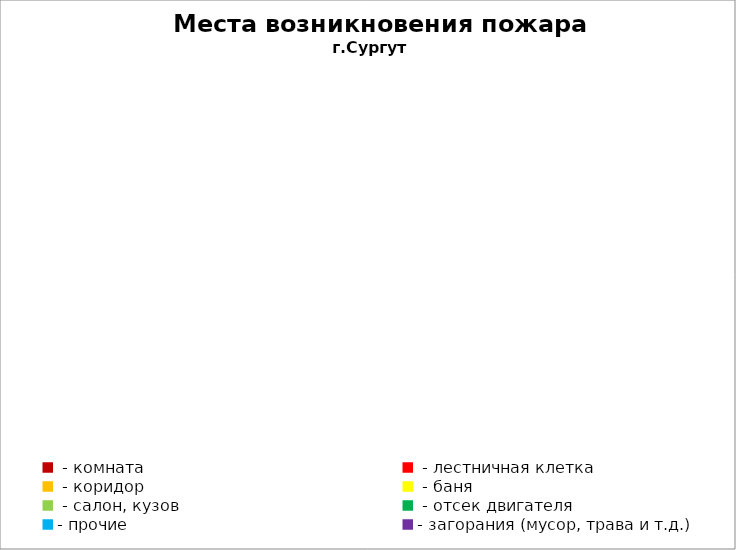
| Category | Места возникновения пожара |
|---|---|
|  - комната | 7 |
|  - лестничная клетка | 1 |
|  - коридор | 0 |
|  - баня | 2 |
|  - салон, кузов | 3 |
|  - отсек двигателя | 15 |
| - прочие | 39 |
| - загорания (мусор, трава и т.д.)  | 9 |